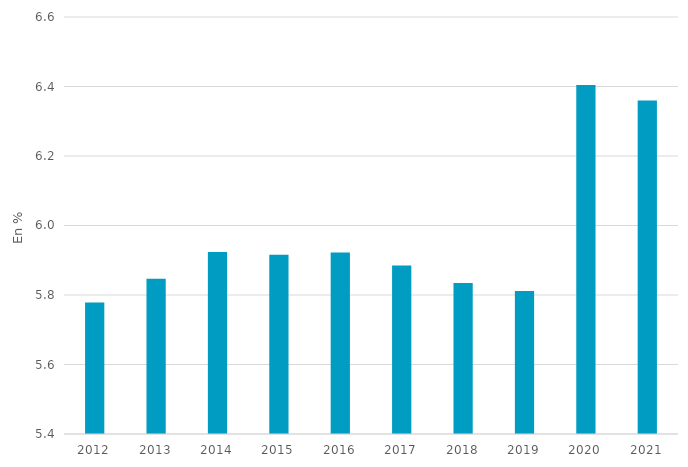
| Category | Part de la consommation de soins hospitaliers dans la consommation finale effective des ménages (en %) |
|---|---|
| 2012.0 | 5.779 |
| 2013.0 | 5.847 |
| 2014.0 | 5.924 |
| 2015.0 | 5.916 |
| 2016.0 | 5.922 |
| 2017.0 | 5.885 |
| 2018.0 | 5.834 |
| 2019.0 | 5.811 |
| 2020.0 | 6.405 |
| 2021.0 | 6.36 |